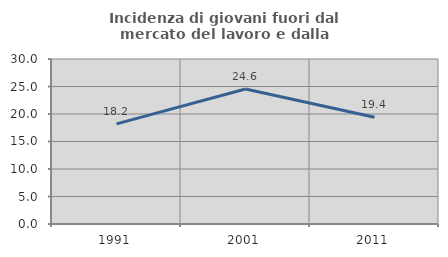
| Category | Incidenza di giovani fuori dal mercato del lavoro e dalla formazione  |
|---|---|
| 1991.0 | 18.214 |
| 2001.0 | 24.553 |
| 2011.0 | 19.421 |